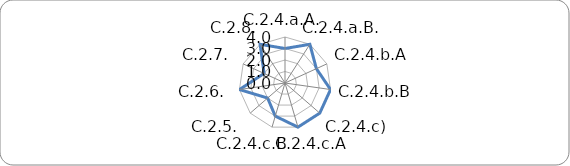
| Category | Series 0 |
|---|---|
| C.2.4.a.A. | 3 |
| C.2.4.a.B. | 4 |
| C.2.4.b.A | 3 |
| C.2.4.b.B | 4 |
| C.2.4.c)  | 4 |
| C.2.4.c.A | 4 |
| C.2.4.c.B | 3 |
| C.2.5. | 2 |
| C.2.6. | 4 |
| C.2.7. | 2 |
| C.2.8. | 4 |